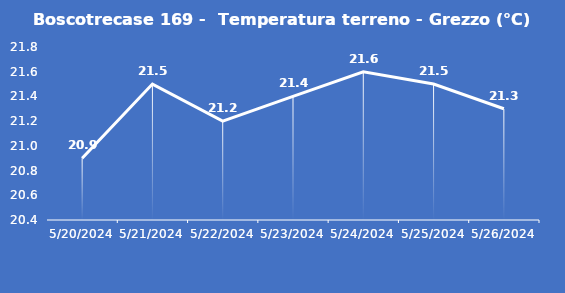
| Category | Boscotrecase 169 -  Temperatura terreno - Grezzo (°C) |
|---|---|
| 5/20/24 | 20.9 |
| 5/21/24 | 21.5 |
| 5/22/24 | 21.2 |
| 5/23/24 | 21.4 |
| 5/24/24 | 21.6 |
| 5/25/24 | 21.5 |
| 5/26/24 | 21.3 |